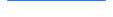
| Category | Series 0 |
|---|---|
| 0 | 95 |
| 1 | 107 |
| 2 | 77 |
| 3 | 80 |
| 4 | 78 |
| 5 | 68 |
| 6 | 59 |
| 7 | 74 |
| 8 | 75 |